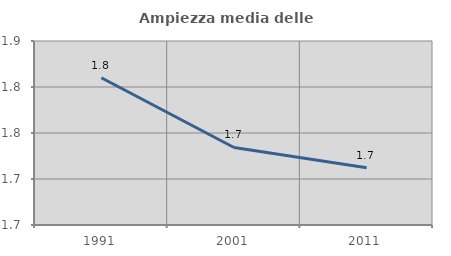
| Category | Ampiezza media delle famiglie |
|---|---|
| 1991.0 | 1.81 |
| 2001.0 | 1.734 |
| 2011.0 | 1.712 |